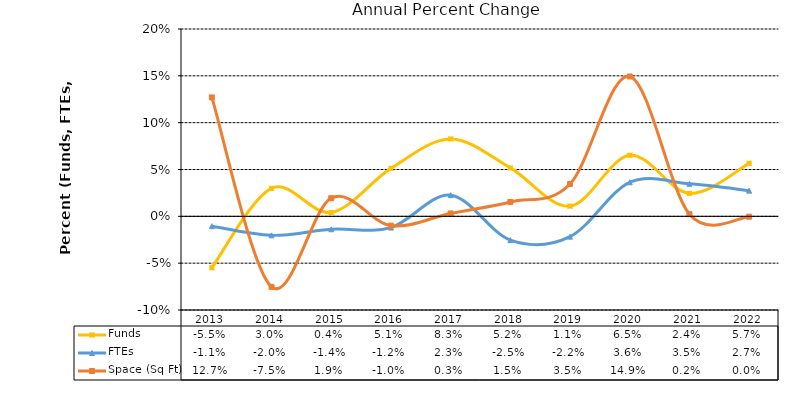
| Category | Funds | FTEs | Space (Sq Ft) |
|---|---|---|---|
| 2013.0 | -0.055 | -0.011 | 0.127 |
| 2014.0 | 0.03 | -0.02 | -0.075 |
| 2015.0 | 0.004 | -0.014 | 0.019 |
| 2016.0 | 0.051 | -0.012 | -0.01 |
| 2017.0 | 0.083 | 0.023 | 0.003 |
| 2018.0 | 0.052 | -0.025 | 0.015 |
| 2019.0 | 0.011 | -0.022 | 0.035 |
| 2020.0 | 0.065 | 0.036 | 0.149 |
| 2021.0 | 0.024 | 0.035 | 0.002 |
| 2022.0 | 0.057 | 0.027 | 0 |